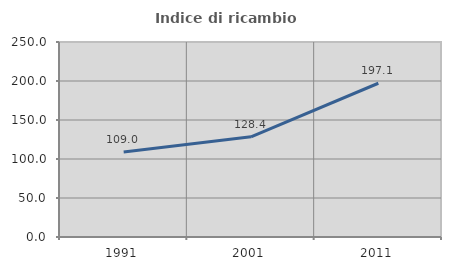
| Category | Indice di ricambio occupazionale  |
|---|---|
| 1991.0 | 108.966 |
| 2001.0 | 128.448 |
| 2011.0 | 197.115 |